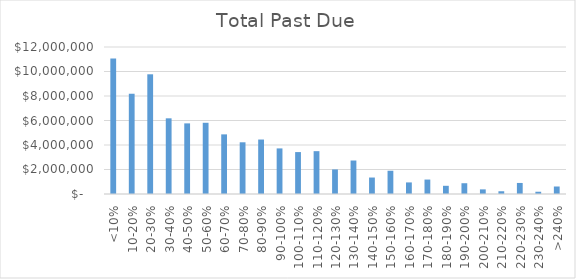
| Category |  Total Past Due  |
|---|---|
| <10% | 11067065.92 |
| 10-20% | 8184130.85 |
| 20-30% | 9771906 |
| 30-40% | 6177787 |
| 40-50% | 5765062.46 |
| 50-60% | 5813970.39 |
| 60-70% | 4868153.99 |
| 70-80% | 4221519.51 |
| 80-90% | 4445982.19 |
| 90-100% | 3721623.49 |
| 100-110% | 3422248.48 |
| 110-120% | 3497029.15 |
| 120-130% | 2006581.5 |
| 130-140% | 2733775.47 |
| 140-150% | 1344618.86 |
| 150-160% | 1898253.78 |
| 160-170% | 945778.65 |
| 170-180% | 1178810.19 |
| 180-190% | 669220.84 |
| 190-200% | 879279.81 |
| 200-210% | 377570.59 |
| 210-220% | 224762.49 |
| 220-230% | 901491.26 |
| 230-240% | 184761.44 |
| >240% | 611979.59 |